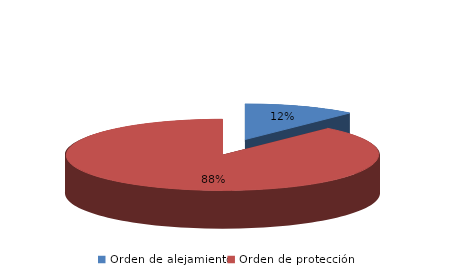
| Category | Series 0 |
|---|---|
| Orden de alejamiento | 11 |
| Orden de protección | 84 |